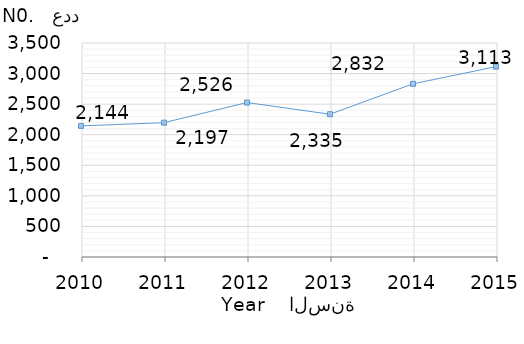
| Category | القيمة
Value |
|---|---|
| 2015.0 | 3113 |
| 2014.0 | 2832 |
| 2013.0 | 2335 |
| 2012.0 | 2526 |
| 2011.0 | 2197 |
| 2010.0 | 2144 |